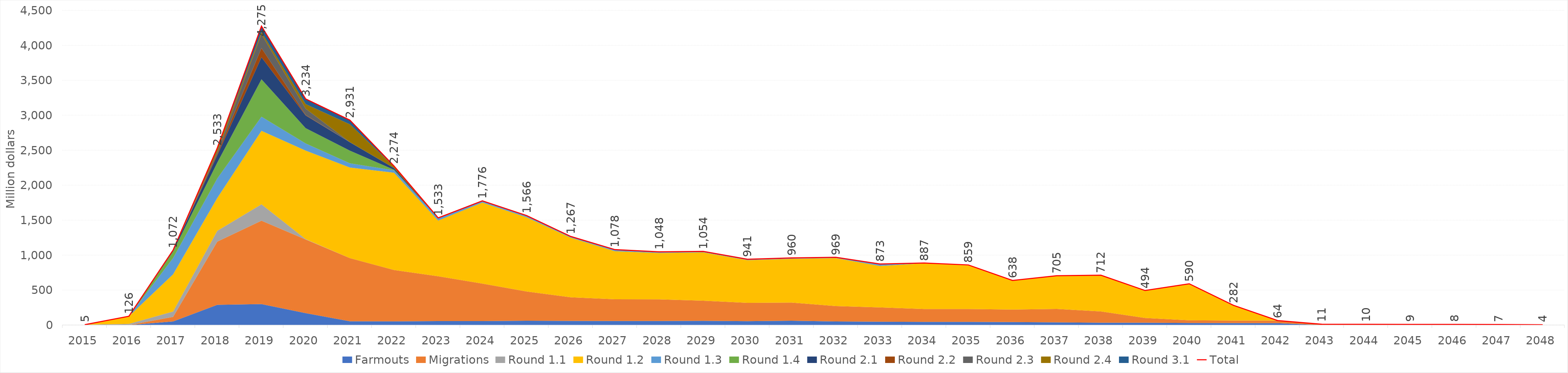
| Category | Total |
|---|---|
| 2015.0 | 4.809 |
| 2016.0 | 125.699 |
| 2017.0 | 1072.307 |
| 2018.0 | 2532.947 |
| 2019.0 | 4275.031 |
| 2020.0 | 3233.97 |
| 2021.0 | 2930.564 |
| 2022.0 | 2273.901 |
| 2023.0 | 1532.701 |
| 2024.0 | 1776.488 |
| 2025.0 | 1566.321 |
| 2026.0 | 1267.105 |
| 2027.0 | 1078.371 |
| 2028.0 | 1047.518 |
| 2029.0 | 1053.757 |
| 2030.0 | 940.795 |
| 2031.0 | 960.225 |
| 2032.0 | 969.091 |
| 2033.0 | 872.99 |
| 2034.0 | 886.82 |
| 2035.0 | 859.452 |
| 2036.0 | 637.757 |
| 2037.0 | 705.204 |
| 2038.0 | 712.26 |
| 2039.0 | 493.604 |
| 2040.0 | 589.951 |
| 2041.0 | 282.456 |
| 2042.0 | 63.974 |
| 2043.0 | 11.076 |
| 2044.0 | 10.397 |
| 2045.0 | 9.347 |
| 2046.0 | 8.4 |
| 2047.0 | 7.386 |
| 2048.0 | 3.884 |